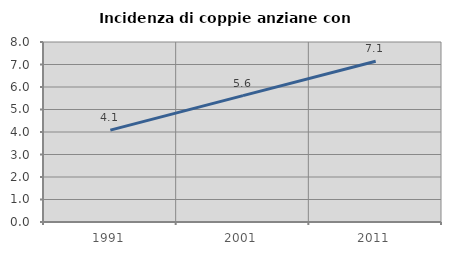
| Category | Incidenza di coppie anziane con figli |
|---|---|
| 1991.0 | 4.082 |
| 2001.0 | 5.618 |
| 2011.0 | 7.143 |